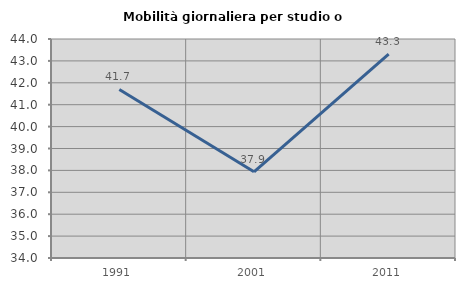
| Category | Mobilità giornaliera per studio o lavoro |
|---|---|
| 1991.0 | 41.698 |
| 2001.0 | 37.935 |
| 2011.0 | 43.308 |